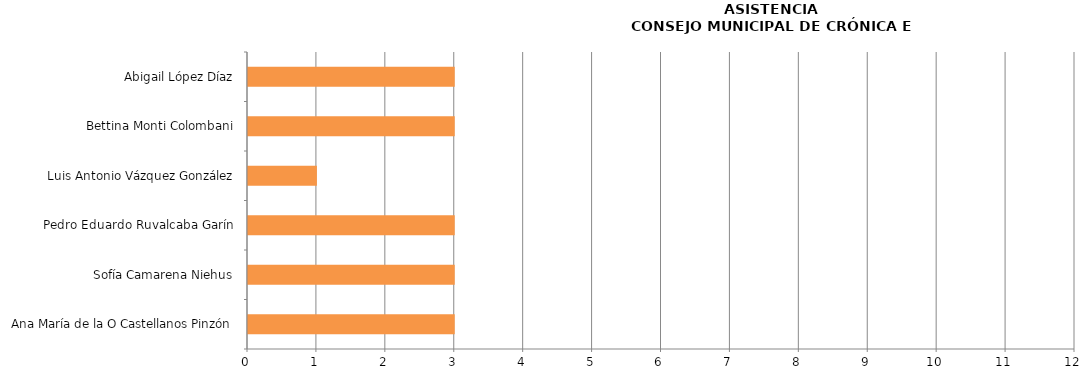
| Category | Series 0 |
|---|---|
| Ana María de la O Castellanos Pinzón | 3 |
| Sofía Camarena Niehus | 3 |
| Pedro Eduardo Ruvalcaba Garín | 3 |
| Luis Antonio Vázquez González | 1 |
| Bettina Monti Colombani | 3 |
| Abigail López Díaz | 3 |